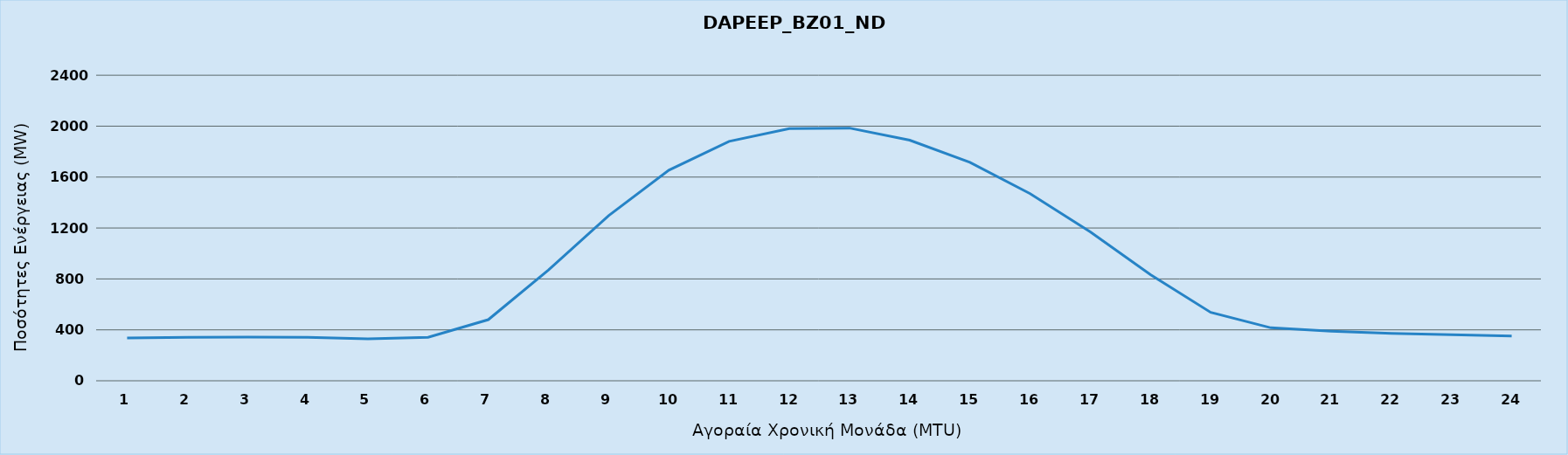
| Category | DAPEEP_BZ01_NDR |
|---|---|
| 0 | 336 |
| 1 | 342 |
| 2 | 343 |
| 3 | 342 |
| 4 | 329 |
| 5 | 341 |
| 6 | 480 |
| 7 | 870 |
| 8 | 1298 |
| 9 | 1654 |
| 10 | 1881 |
| 11 | 1981 |
| 12 | 1985 |
| 13 | 1890 |
| 14 | 1716 |
| 15 | 1470 |
| 16 | 1169 |
| 17 | 834 |
| 18 | 537 |
| 19 | 416 |
| 20 | 390 |
| 21 | 372 |
| 22 | 362 |
| 23 | 352 |